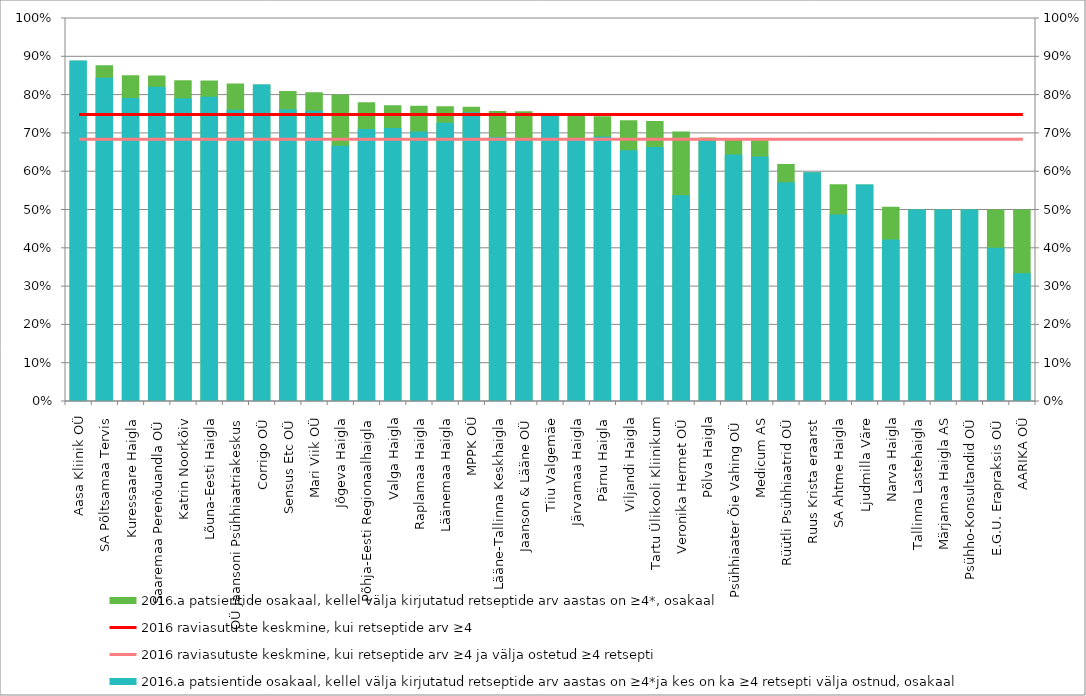
| Category | 2016.a patsientide osakaal, kellel välja kirjutatud retseptide arv aastas on ≥4*, osakaal |
|---|---|
| Aasa Kliinik OÜ | 0.889 |
| SA Põltsamaa Tervis | 0.876 |
| Kuressaare Haigla | 0.851 |
| Saaremaa Perenõuandla OÜ | 0.85 |
| Katrin Noorkõiv | 0.837 |
| Lõuna-Eesti Haigla | 0.837 |
| OÜ Jaansoni Psühhiaatriakeskus | 0.829 |
| Corrigo OÜ | 0.826 |
| Sensus Etc OÜ | 0.81 |
| Mari Viik OÜ | 0.806 |
| Jõgeva Haigla | 0.8 |
| Põhja-Eesti Regionaalhaigla | 0.78 |
| Valga Haigla | 0.772 |
| Raplamaa Haigla | 0.771 |
| Läänemaa Haigla | 0.77 |
| MPPK OÜ | 0.768 |
| Lääne-Tallinna Keskhaigla | 0.757 |
| Jaanson & Lääne OÜ | 0.756 |
| Tiiu Valgemäe | 0.75 |
| Järvamaa Haigla | 0.75 |
| Pärnu Haigla | 0.743 |
| Viljandi Haigla | 0.733 |
| Tartu Ülikooli Kliinikum | 0.731 |
| Veronika Hermet OÜ | 0.704 |
| Põlva Haigla | 0.688 |
| Psühhiaater Õie Vahing OÜ | 0.685 |
| Medicum AS | 0.681 |
| Rüütli Psühhiaatrid OÜ | 0.619 |
| Ruus Krista eraarst | 0.597 |
| SA Ahtme Haigla | 0.566 |
| Ljudmilla Väre | 0.565 |
| Narva Haigla | 0.507 |
| Tallinna Lastehaigla | 0.5 |
| Märjamaa Haigla AS | 0.5 |
| Psühho-Konsultandid OÜ | 0.5 |
| E.G.U. Erapraksis OÜ | 0.5 |
| AARIKA OÜ | 0.5 |